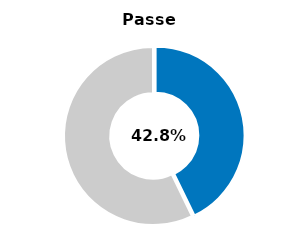
| Category | Series 0 |
|---|---|
| Passed | 0.428 |
| Other | 0.572 |